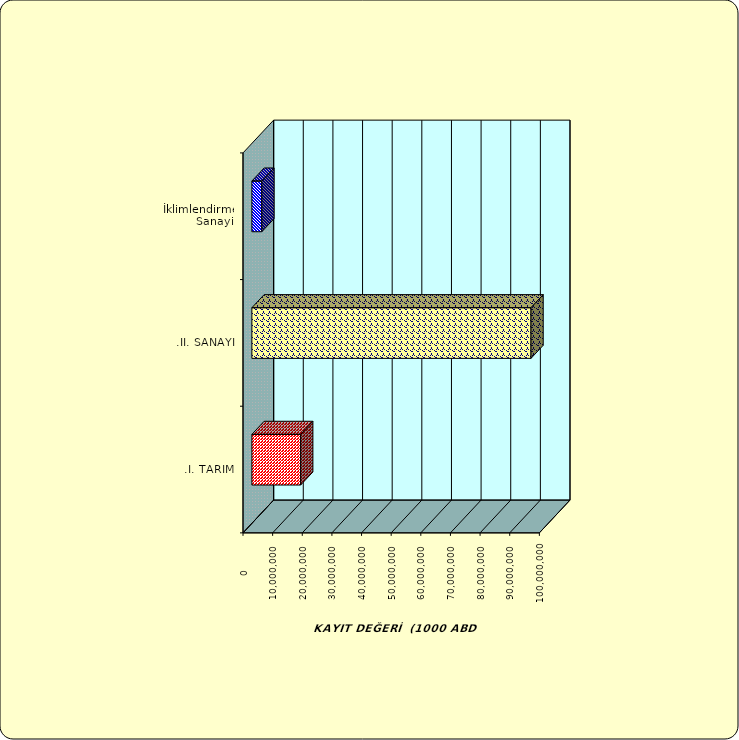
| Category | Series 0 |
|---|---|
| .I. TARIM | 16462925.533 |
| .II. SANAYİ | 94180057.017 |
|  İklimlendirme Sanayii | 3363880.779 |